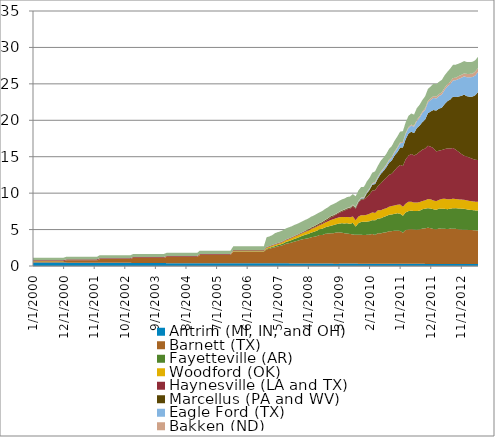
| Category | Antrim (MI, IN, and OH) | Barnett (TX) | Fayetteville (AR) | Woodford (OK) | Haynesville (LA and TX) | Marcellus (PA and WV) | Eagle Ford (TX) | Bakken (ND) | Rest of US |
|---|---|---|---|---|---|---|---|---|---|
| 1/1/00 | 0.481 | 0.184 | 0 | 0.009 | 0.128 | 0.001 | 0 | 0.005 | 0.332 |
| 2/1/00 | 0.481 | 0.184 | 0 | 0.009 | 0.128 | 0.001 | 0 | 0.005 | 0.332 |
| 3/1/00 | 0.481 | 0.184 | 0 | 0.009 | 0.128 | 0.001 | 0 | 0.005 | 0.332 |
| 4/1/00 | 0.481 | 0.184 | 0 | 0.009 | 0.128 | 0.001 | 0 | 0.005 | 0.332 |
| 5/1/00 | 0.481 | 0.184 | 0 | 0.009 | 0.128 | 0.001 | 0 | 0.005 | 0.332 |
| 6/1/00 | 0.481 | 0.184 | 0 | 0.009 | 0.128 | 0.001 | 0 | 0.005 | 0.332 |
| 7/1/00 | 0.481 | 0.184 | 0 | 0.009 | 0.128 | 0.001 | 0 | 0.005 | 0.332 |
| 8/1/00 | 0.481 | 0.184 | 0 | 0.009 | 0.128 | 0.001 | 0 | 0.005 | 0.332 |
| 9/1/00 | 0.481 | 0.184 | 0 | 0.009 | 0.128 | 0.001 | 0 | 0.005 | 0.332 |
| 10/1/00 | 0.481 | 0.184 | 0 | 0.009 | 0.128 | 0.001 | 0 | 0.005 | 0.332 |
| 11/1/00 | 0.481 | 0.184 | 0 | 0.009 | 0.128 | 0.001 | 0 | 0.005 | 0.332 |
| 12/1/00 | 0.481 | 0.184 | 0 | 0.009 | 0.128 | 0.001 | 0 | 0.005 | 0.332 |
| 1/1/01 | 0.461 | 0.314 | 0 | 0.009 | 0.125 | 0.001 | 0 | 0.005 | 0.359 |
| 2/1/01 | 0.461 | 0.314 | 0 | 0.009 | 0.125 | 0.001 | 0 | 0.005 | 0.359 |
| 3/1/01 | 0.461 | 0.314 | 0 | 0.009 | 0.125 | 0.001 | 0 | 0.005 | 0.359 |
| 4/1/01 | 0.461 | 0.314 | 0 | 0.009 | 0.125 | 0.001 | 0 | 0.005 | 0.359 |
| 5/1/01 | 0.461 | 0.314 | 0 | 0.009 | 0.125 | 0.001 | 0 | 0.005 | 0.359 |
| 6/1/01 | 0.461 | 0.314 | 0 | 0.009 | 0.125 | 0.001 | 0 | 0.005 | 0.359 |
| 7/1/01 | 0.461 | 0.314 | 0 | 0.009 | 0.125 | 0.001 | 0 | 0.005 | 0.359 |
| 8/1/01 | 0.461 | 0.314 | 0 | 0.009 | 0.125 | 0.001 | 0 | 0.005 | 0.359 |
| 9/1/01 | 0.461 | 0.314 | 0 | 0.009 | 0.125 | 0.001 | 0 | 0.005 | 0.359 |
| 10/1/01 | 0.461 | 0.314 | 0 | 0.009 | 0.125 | 0.001 | 0 | 0.005 | 0.359 |
| 11/1/01 | 0.461 | 0.314 | 0 | 0.009 | 0.125 | 0.001 | 0 | 0.005 | 0.359 |
| 12/1/01 | 0.461 | 0.314 | 0 | 0.009 | 0.125 | 0.001 | 0 | 0.005 | 0.359 |
| 1/1/02 | 0.438 | 0.508 | 0 | 0.009 | 0.121 | 0 | 0 | 0.004 | 0.39 |
| 2/1/02 | 0.438 | 0.508 | 0 | 0.009 | 0.121 | 0 | 0 | 0.004 | 0.39 |
| 3/1/02 | 0.438 | 0.508 | 0 | 0.009 | 0.121 | 0 | 0 | 0.004 | 0.39 |
| 4/1/02 | 0.438 | 0.508 | 0 | 0.009 | 0.121 | 0 | 0 | 0.004 | 0.39 |
| 5/1/02 | 0.438 | 0.508 | 0 | 0.009 | 0.121 | 0 | 0 | 0.004 | 0.39 |
| 6/1/02 | 0.438 | 0.508 | 0 | 0.009 | 0.121 | 0 | 0 | 0.004 | 0.39 |
| 7/1/02 | 0.438 | 0.508 | 0 | 0.009 | 0.121 | 0 | 0 | 0.004 | 0.39 |
| 8/1/02 | 0.438 | 0.508 | 0 | 0.009 | 0.121 | 0 | 0 | 0.004 | 0.39 |
| 9/1/02 | 0.438 | 0.508 | 0 | 0.009 | 0.121 | 0 | 0 | 0.004 | 0.39 |
| 10/1/02 | 0.438 | 0.508 | 0 | 0.009 | 0.121 | 0 | 0 | 0.004 | 0.39 |
| 11/1/02 | 0.438 | 0.508 | 0 | 0.009 | 0.121 | 0 | 0 | 0.004 | 0.39 |
| 12/1/02 | 0.438 | 0.508 | 0 | 0.009 | 0.121 | 0 | 0 | 0.004 | 0.39 |
| 1/1/03 | 0.405 | 0.706 | 0 | 0.01 | 0.106 | 0 | 0 | 0.004 | 0.414 |
| 2/1/03 | 0.405 | 0.706 | 0 | 0.01 | 0.106 | 0 | 0 | 0.004 | 0.414 |
| 3/1/03 | 0.405 | 0.706 | 0 | 0.01 | 0.106 | 0 | 0 | 0.004 | 0.414 |
| 4/1/03 | 0.405 | 0.706 | 0 | 0.01 | 0.106 | 0 | 0 | 0.004 | 0.414 |
| 5/1/03 | 0.405 | 0.706 | 0 | 0.01 | 0.106 | 0 | 0 | 0.004 | 0.414 |
| 6/1/03 | 0.405 | 0.706 | 0 | 0.01 | 0.106 | 0 | 0 | 0.004 | 0.414 |
| 7/1/03 | 0.405 | 0.706 | 0 | 0.01 | 0.106 | 0 | 0 | 0.004 | 0.414 |
| 8/1/03 | 0.405 | 0.706 | 0 | 0.01 | 0.106 | 0 | 0 | 0.004 | 0.414 |
| 9/1/03 | 0.405 | 0.706 | 0 | 0.01 | 0.106 | 0 | 0 | 0.004 | 0.414 |
| 10/1/03 | 0.405 | 0.706 | 0 | 0.01 | 0.106 | 0 | 0 | 0.004 | 0.414 |
| 11/1/03 | 0.405 | 0.706 | 0 | 0.01 | 0.106 | 0 | 0 | 0.004 | 0.414 |
| 12/1/03 | 0.405 | 0.706 | 0 | 0.01 | 0.106 | 0 | 0 | 0.004 | 0.414 |
| 1/1/04 | 0.391 | 0.857 | 0 | 0.015 | 0.097 | 0 | 0 | 0.004 | 0.437 |
| 2/1/04 | 0.391 | 0.857 | 0 | 0.015 | 0.097 | 0 | 0 | 0.004 | 0.437 |
| 3/1/04 | 0.391 | 0.857 | 0 | 0.015 | 0.097 | 0 | 0 | 0.004 | 0.437 |
| 4/1/04 | 0.391 | 0.857 | 0 | 0.015 | 0.097 | 0 | 0 | 0.004 | 0.437 |
| 5/1/04 | 0.391 | 0.857 | 0 | 0.015 | 0.097 | 0 | 0 | 0.004 | 0.437 |
| 6/1/04 | 0.391 | 0.857 | 0 | 0.015 | 0.097 | 0 | 0 | 0.004 | 0.437 |
| 7/1/04 | 0.391 | 0.857 | 0 | 0.015 | 0.097 | 0 | 0 | 0.004 | 0.437 |
| 8/1/04 | 0.391 | 0.857 | 0 | 0.015 | 0.097 | 0 | 0 | 0.004 | 0.437 |
| 9/1/04 | 0.391 | 0.857 | 0 | 0.015 | 0.097 | 0 | 0 | 0.004 | 0.437 |
| 10/1/04 | 0.391 | 0.857 | 0 | 0.015 | 0.097 | 0 | 0 | 0.004 | 0.437 |
| 11/1/04 | 0.391 | 0.857 | 0 | 0.015 | 0.097 | 0 | 0 | 0.004 | 0.437 |
| 12/1/04 | 0.391 | 0.857 | 0 | 0.015 | 0.097 | 0 | 0 | 0.004 | 0.437 |
| 1/1/05 | 0.381 | 1.134 | 0.006 | 0.025 | 0.091 | 0.002 | 0 | 0.005 | 0.459 |
| 2/1/05 | 0.381 | 1.134 | 0.006 | 0.025 | 0.091 | 0.002 | 0 | 0.005 | 0.459 |
| 3/1/05 | 0.381 | 1.134 | 0.006 | 0.025 | 0.091 | 0.002 | 0 | 0.005 | 0.459 |
| 4/1/05 | 0.381 | 1.134 | 0.006 | 0.025 | 0.091 | 0.002 | 0 | 0.005 | 0.459 |
| 5/1/05 | 0.381 | 1.134 | 0.006 | 0.025 | 0.091 | 0.002 | 0 | 0.005 | 0.459 |
| 6/1/05 | 0.381 | 1.134 | 0.006 | 0.025 | 0.091 | 0.002 | 0 | 0.005 | 0.459 |
| 7/1/05 | 0.381 | 1.134 | 0.006 | 0.025 | 0.091 | 0.002 | 0 | 0.005 | 0.459 |
| 8/1/05 | 0.381 | 1.134 | 0.006 | 0.025 | 0.091 | 0.002 | 0 | 0.005 | 0.459 |
| 9/1/05 | 0.381 | 1.134 | 0.006 | 0.025 | 0.091 | 0.002 | 0 | 0.005 | 0.459 |
| 10/1/05 | 0.381 | 1.134 | 0.006 | 0.025 | 0.091 | 0.002 | 0 | 0.005 | 0.459 |
| 11/1/05 | 0.381 | 1.134 | 0.006 | 0.025 | 0.091 | 0.002 | 0 | 0.005 | 0.459 |
| 12/1/05 | 0.381 | 1.134 | 0.006 | 0.025 | 0.091 | 0.002 | 0 | 0.005 | 0.459 |
| 1/1/06 | 0.373 | 1.61 | 0.04 | 0.071 | 0.082 | 0.012 | 0 | 0.007 | 0.506 |
| 2/1/06 | 0.373 | 1.61 | 0.04 | 0.071 | 0.082 | 0.012 | 0 | 0.007 | 0.506 |
| 3/1/06 | 0.373 | 1.61 | 0.04 | 0.071 | 0.082 | 0.012 | 0 | 0.007 | 0.506 |
| 4/1/06 | 0.373 | 1.61 | 0.04 | 0.071 | 0.082 | 0.012 | 0 | 0.007 | 0.506 |
| 5/1/06 | 0.373 | 1.61 | 0.04 | 0.071 | 0.082 | 0.012 | 0 | 0.007 | 0.506 |
| 6/1/06 | 0.373 | 1.61 | 0.04 | 0.071 | 0.082 | 0.012 | 0 | 0.007 | 0.506 |
| 7/1/06 | 0.373 | 1.61 | 0.04 | 0.071 | 0.082 | 0.012 | 0 | 0.007 | 0.506 |
| 8/1/06 | 0.373 | 1.61 | 0.04 | 0.071 | 0.082 | 0.012 | 0 | 0.007 | 0.506 |
| 9/1/06 | 0.373 | 1.61 | 0.04 | 0.071 | 0.082 | 0.012 | 0 | 0.007 | 0.506 |
| 10/1/06 | 0.373 | 1.61 | 0.04 | 0.071 | 0.082 | 0.012 | 0 | 0.007 | 0.506 |
| 11/1/06 | 0.373 | 1.61 | 0.04 | 0.071 | 0.082 | 0.012 | 0 | 0.007 | 0.506 |
| 12/1/06 | 0.373 | 1.61 | 0.04 | 0.071 | 0.082 | 0.012 | 0 | 0.007 | 0.506 |
| 1/1/07 | 0.362 | 1.921 | 0.099 | 0.131 | 0.081 | 0.02 | 0 | 0.009 | 1.327 |
| 2/1/07 | 0.362 | 1.999 | 0.115 | 0.146 | 0.081 | 0.022 | 0 | 0.009 | 1.327 |
| 3/1/07 | 0.362 | 2.123 | 0.138 | 0.166 | 0.079 | 0.023 | 0 | 0.009 | 1.327 |
| 4/1/07 | 0.363 | 2.208 | 0.157 | 0.176 | 0.077 | 0.024 | 0 | 0.013 | 1.493 |
| 5/1/07 | 0.363 | 2.33 | 0.171 | 0.173 | 0.078 | 0.024 | 0 | 0.013 | 1.493 |
| 6/1/07 | 0.363 | 2.41 | 0.193 | 0.189 | 0.078 | 0.026 | 0 | 0.013 | 1.493 |
| 7/1/07 | 0.36 | 2.523 | 0.227 | 0.21 | 0.077 | 0.026 | 0 | 0.016 | 1.508 |
| 8/1/07 | 0.36 | 2.692 | 0.26 | 0.231 | 0.078 | 0.025 | 0 | 0.016 | 1.508 |
| 9/1/07 | 0.36 | 2.769 | 0.288 | 0.257 | 0.08 | 0.029 | 0 | 0.016 | 1.508 |
| 10/1/07 | 0.358 | 2.869 | 0.329 | 0.283 | 0.081 | 0.031 | 0 | 0.019 | 1.481 |
| 11/1/07 | 0.358 | 2.989 | 0.376 | 0.296 | 0.081 | 0.034 | 0 | 0.019 | 1.481 |
| 12/1/07 | 0.358 | 3.086 | 0.405 | 0.322 | 0.081 | 0.036 | 0 | 0.019 | 1.481 |
| 1/1/08 | 0.338 | 3.24 | 0.436 | 0.352 | 0.085 | 0.036 | 0 | 0.015 | 1.465 |
| 2/1/08 | 0.338 | 3.337 | 0.493 | 0.366 | 0.083 | 0.057 | 0 | 0.015 | 1.465 |
| 3/1/08 | 0.338 | 3.406 | 0.564 | 0.398 | 0.084 | 0.077 | 0 | 0.015 | 1.465 |
| 4/1/08 | 0.337 | 3.468 | 0.598 | 0.443 | 0.096 | 0.09 | 0.001 | 0.022 | 1.469 |
| 5/1/08 | 0.337 | 3.605 | 0.633 | 0.494 | 0.102 | 0.109 | 0.001 | 0.022 | 1.469 |
| 6/1/08 | 0.337 | 3.67 | 0.683 | 0.528 | 0.103 | 0.117 | 0.002 | 0.022 | 1.469 |
| 7/1/08 | 0.339 | 3.758 | 0.737 | 0.569 | 0.115 | 0.136 | 0 | 0.029 | 1.471 |
| 8/1/08 | 0.339 | 3.905 | 0.791 | 0.561 | 0.128 | 0.14 | 0 | 0.029 | 1.471 |
| 9/1/08 | 0.339 | 3.909 | 0.874 | 0.63 | 0.151 | 0.139 | 0.002 | 0.029 | 1.471 |
| 10/1/08 | 0.333 | 4.071 | 0.902 | 0.66 | 0.183 | 0.148 | 0.004 | 0.037 | 1.489 |
| 11/1/08 | 0.333 | 4.118 | 0.952 | 0.712 | 0.247 | 0.149 | 0.004 | 0.037 | 1.489 |
| 12/1/08 | 0.333 | 4.148 | 1.034 | 0.788 | 0.348 | 0.155 | 0.004 | 0.037 | 1.489 |
| 1/1/09 | 0.326 | 4.176 | 1.109 | 0.81 | 0.402 | 0.134 | 0.005 | 0.039 | 1.498 |
| 2/1/09 | 0.326 | 4.269 | 1.131 | 0.839 | 0.488 | 0.096 | 0.008 | 0.039 | 1.498 |
| 3/1/09 | 0.326 | 4.295 | 1.196 | 0.864 | 0.586 | 0.111 | 0.011 | 0.039 | 1.498 |
| 4/1/09 | 0.327 | 4.252 | 1.282 | 0.866 | 0.739 | 0.115 | 0.014 | 0.048 | 1.488 |
| 5/1/09 | 0.327 | 4.172 | 1.343 | 0.862 | 0.885 | 0.121 | 0.018 | 0.048 | 1.488 |
| 6/1/09 | 0.327 | 4.119 | 1.417 | 0.879 | 1.05 | 0.12 | 0.023 | 0.048 | 1.488 |
| 7/1/09 | 0.331 | 4.065 | 1.384 | 0.899 | 1.19 | 0.122 | 0.031 | 0.058 | 1.452 |
| 8/1/09 | 0.331 | 4.001 | 1.59 | 0.874 | 1.397 | 0.131 | 0.041 | 0.058 | 1.452 |
| 9/1/09 | 0.331 | 3.943 | 1.141 | 0.866 | 1.587 | 0.14 | 0.052 | 0.058 | 1.452 |
| 10/1/09 | 0.323 | 3.971 | 1.585 | 0.912 | 1.864 | 0.145 | 0.075 | 0.062 | 1.423 |
| 11/1/09 | 0.323 | 3.955 | 1.773 | 0.932 | 2.129 | 0.144 | 0.108 | 0.062 | 1.423 |
| 12/1/09 | 0.323 | 3.936 | 1.815 | 0.883 | 2.181 | 0.131 | 0.108 | 0.062 | 1.423 |
| 1/1/10 | 0.312 | 3.963 | 1.811 | 0.943 | 2.444 | 0.474 | 0.118 | 0.08 | 1.449 |
| 2/1/10 | 0.312 | 3.992 | 1.841 | 1.025 | 2.654 | 0.628 | 0.126 | 0.08 | 1.449 |
| 3/1/10 | 0.312 | 4.089 | 1.898 | 1.055 | 3.014 | 0.786 | 0.139 | 0.08 | 1.449 |
| 4/1/10 | 0.308 | 3.953 | 2 | 1.022 | 3.11 | 0.858 | 0.156 | 0.101 | 1.474 |
| 5/1/10 | 0.308 | 4.19 | 2.028 | 1.122 | 3.32 | 1.025 | 0.191 | 0.101 | 1.474 |
| 6/1/10 | 0.308 | 4.162 | 2.071 | 1.097 | 3.667 | 1.309 | 0.234 | 0.101 | 1.474 |
| 7/1/10 | 0.308 | 4.271 | 2.142 | 1.1 | 3.94 | 1.279 | 0.246 | 0.122 | 1.46 |
| 8/1/10 | 0.308 | 4.317 | 2.228 | 1.062 | 4.172 | 1.433 | 0.278 | 0.122 | 1.46 |
| 9/1/10 | 0.308 | 4.469 | 2.259 | 1.097 | 4.374 | 1.647 | 0.323 | 0.122 | 1.46 |
| 10/1/10 | 0.305 | 4.481 | 2.284 | 1.165 | 4.429 | 1.822 | 0.36 | 0.139 | 1.483 |
| 11/1/10 | 0.305 | 4.536 | 2.317 | 1.153 | 4.806 | 2.04 | 0.411 | 0.139 | 1.483 |
| 12/1/10 | 0.305 | 4.55 | 2.378 | 1.174 | 5.143 | 2.074 | 0.536 | 0.139 | 1.483 |
| 1/1/11 | 0.299 | 4.514 | 2.373 | 1.26 | 5.425 | 2.376 | 0.597 | 0.123 | 1.475 |
| 2/1/11 | 0.299 | 4.255 | 2.345 | 1.237 | 5.602 | 2.534 | 0.645 | 0.123 | 1.475 |
| 3/1/11 | 0.299 | 4.643 | 2.412 | 1.202 | 6.08 | 2.777 | 0.722 | 0.123 | 1.475 |
| 4/1/11 | 0.292 | 4.712 | 2.529 | 1.286 | 6.335 | 3.014 | 0.776 | 0.137 | 1.523 |
| 5/1/11 | 0.292 | 4.772 | 2.532 | 1.222 | 6.552 | 3.059 | 0.843 | 0.137 | 1.523 |
| 6/1/11 | 0.292 | 4.709 | 2.536 | 1.169 | 6.469 | 3.059 | 0.882 | 0.137 | 1.523 |
| 7/1/11 | 0.295 | 4.689 | 2.565 | 1.162 | 6.646 | 3.57 | 0.97 | 0.182 | 1.59 |
| 8/1/11 | 0.295 | 4.728 | 2.565 | 1.179 | 6.905 | 3.591 | 1.093 | 0.182 | 1.59 |
| 9/1/11 | 0.295 | 4.838 | 2.661 | 1.125 | 7.049 | 3.788 | 1.254 | 0.182 | 1.59 |
| 10/1/11 | 0.291 | 4.878 | 2.696 | 1.146 | 7.115 | 3.98 | 1.341 | 0.22 | 1.635 |
| 11/1/11 | 0.291 | 4.971 | 2.682 | 1.244 | 7.312 | 4.471 | 1.479 | 0.22 | 1.635 |
| 12/1/11 | 0.291 | 4.894 | 2.702 | 1.263 | 7.229 | 4.833 | 1.586 | 0.22 | 1.635 |
| 1/1/12 | 0.284 | 4.79 | 2.71 | 1.202 | 7.183 | 5.243 | 1.654 | 0.256 | 1.705 |
| 2/1/12 | 0.284 | 4.749 | 2.685 | 1.193 | 6.812 | 5.603 | 1.67 | 0.256 | 1.705 |
| 3/1/12 | 0.284 | 4.876 | 2.722 | 1.195 | 6.76 | 5.77 | 1.723 | 0.256 | 1.705 |
| 4/1/12 | 0.279 | 4.831 | 2.756 | 1.335 | 6.719 | 5.81 | 1.816 | 0.3 | 1.699 |
| 5/1/12 | 0.279 | 4.835 | 2.734 | 1.399 | 6.796 | 6.182 | 1.947 | 0.3 | 1.699 |
| 6/1/12 | 0.279 | 4.777 | 2.737 | 1.355 | 6.992 | 6.487 | 2.031 | 0.3 | 1.699 |
| 7/1/12 | 0.275 | 4.863 | 2.733 | 1.289 | 6.951 | 6.731 | 2.107 | 0.341 | 1.799 |
| 8/1/12 | 0.275 | 4.832 | 2.818 | 1.321 | 6.959 | 7.023 | 2.241 | 0.341 | 1.799 |
| 9/1/12 | 0.275 | 4.823 | 2.846 | 1.244 | 6.775 | 7.213 | 2.315 | 0.341 | 1.799 |
| 10/1/12 | 0.271 | 4.765 | 2.855 | 1.254 | 6.528 | 7.579 | 2.415 | 0.4 | 1.701 |
| 11/1/12 | 0.271 | 4.726 | 2.876 | 1.248 | 6.273 | 7.958 | 2.48 | 0.4 | 1.701 |
| 12/1/12 | 0.271 | 4.713 | 2.865 | 1.238 | 6.04 | 8.385 | 2.517 | 0.4 | 1.701 |
| 1/1/13 | 0.266 | 4.698 | 2.809 | 1.229 | 6.024 | 8.282 | 2.598 | 0.464 | 1.626 |
| 2/1/13 | 0.266 | 4.676 | 2.767 | 1.22 | 5.941 | 8.362 | 2.672 | 0.464 | 1.626 |
| 3/1/13 | 0.266 | 4.661 | 2.745 | 1.209 | 5.835 | 8.534 | 2.683 | 0.464 | 1.626 |
| 4/1/13 | 0.262 | 4.633 | 2.737 | 1.198 | 5.763 | 8.841 | 2.718 | 0.538 | 1.544 |
| 5/1/13 | 0.262 | 4.616 | 2.742 | 1.194 | 5.716 | 9.347 | 2.748 | 0.538 | 1.544 |